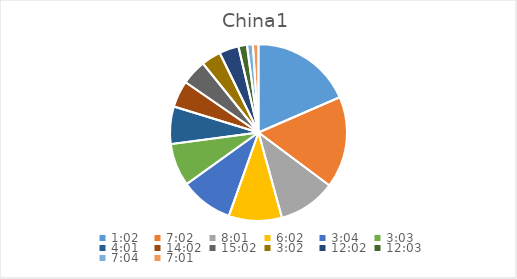
| Category | Series 0 |
|---|---|
| 0.04305555555555556 | 19.62 |
| 0.29305555555555557 | 17.777 |
| 0.3340277777777778 | 11.169 |
| 0.2513888888888889 | 10.309 |
| 0.1277777777777778 | 10.252 |
| 0.12708333333333333 | 8.3 |
| 0.1673611111111111 | 7.268 |
| 0.5847222222222223 | 5.16 |
| 0.6263888888888889 | 4.902 |
| 0.12638888888888888 | 3.783 |
| 0.5013888888888889 | 3.783 |
| 0.5020833333333333 | 1.663 |
| 0.29444444444444445 | 1.134 |
| 0.2923611111111111 | 1.086 |